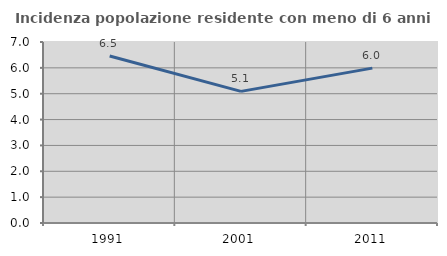
| Category | Incidenza popolazione residente con meno di 6 anni |
|---|---|
| 1991.0 | 6.458 |
| 2001.0 | 5.091 |
| 2011.0 | 5.99 |